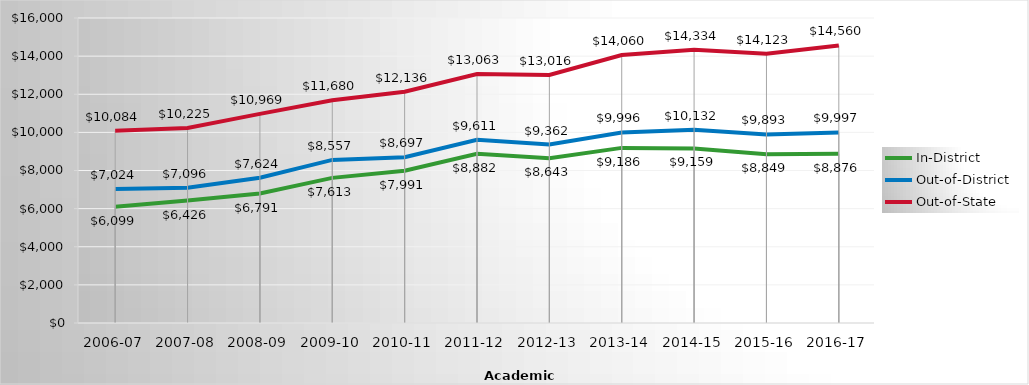
| Category | In-District | Out-of-District | Out-of-State |
|---|---|---|---|
| 2006-07 | 6099 | 7024 | 10084 |
| 2007-08 | 6426 | 7096 | 10225 |
| 2008-09 | 6791 | 7624 | 10969 |
| 2009-10 | 7613 | 8557 | 11680 |
| 2010-11 | 7991 | 8697 | 12136 |
| 2011-12 | 8882 | 9611 | 13063 |
| 2012-13 | 8643.15 | 9362 | 13016 |
| 2013-14 | 9185.83 | 9996.06 | 14060.13 |
| 2014-15 | 9159.04 | 10132.13 | 14333.65 |
| 2015-16 | 8849 | 9893 | 14123 |
| 2016-17 | 8876 | 9997 | 14560 |